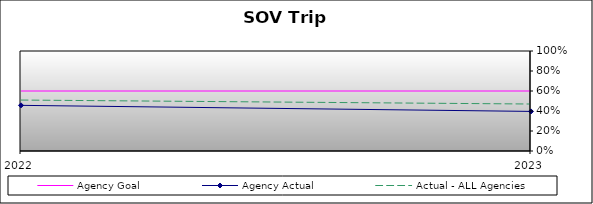
| Category | Agency Goal | Agency Actual | Actual - ALL Agencies |
|---|---|---|---|
| 2022.0 | 0.6 | 0.456 | 0.509 |
| 2023.0 | 0.6 | 0.396 | 0.47 |